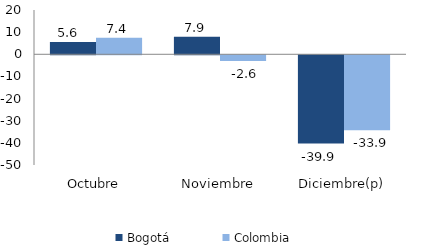
| Category | Bogotá | Colombia |
|---|---|---|
| Octubre | 5.564 | 7.427 |
| Noviembre | 7.871 | -2.627 |
| Diciembre(p) | -39.872 | -33.856 |